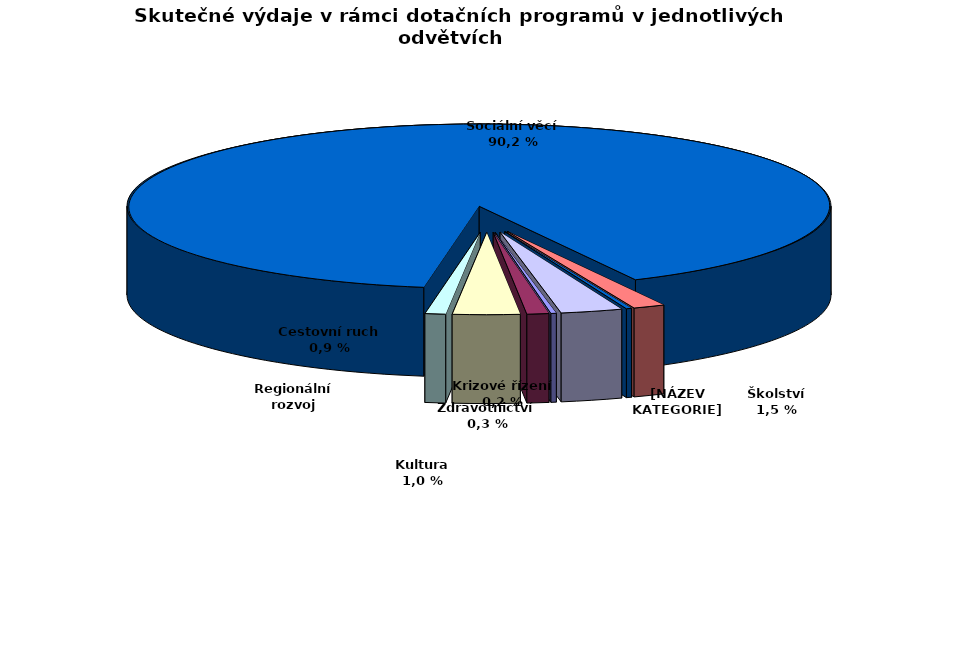
| Category | Series 0 |
|---|---|
| Krizové řízení | 8231.91 |
| Kultura | 33494.747 |
| Regionální rozvoj | 102728.492 |
| Cestovní ruch | 31514.997 |
| Sociální věcí | 3000554.353 |
| Školství | 48763.387 |
| Zdravotnictví | 8279.4 |
| Životní prostředí  | 94483.072 |